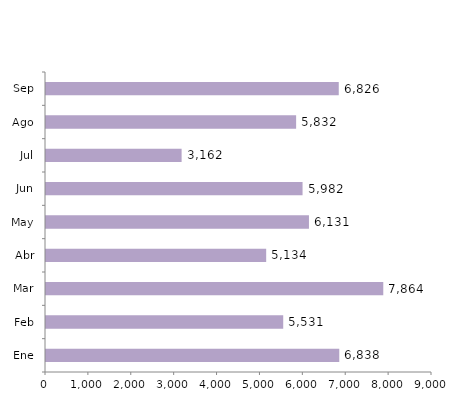
| Category | Series 0 |
|---|---|
| Ene | 6838 |
| Feb | 5531 |
| Mar | 7864 |
| Abr | 5134 |
| May | 6131 |
| Jun | 5982 |
| Jul | 3162 |
| Ago | 5832 |
| Sep | 6826 |